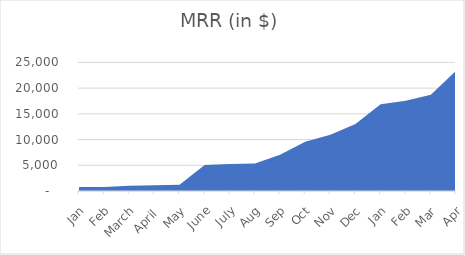
| Category | MRR |
|---|---|
|  Jan  | 761.1 |
|  Feb  | 761.1 |
|  March  | 1007.72 |
|  April   | 1100.94 |
|  May  | 1194.16 |
|  June  | 5074 |
|  July  | 5226.22 |
|  Aug  | 5354.84 |
|  Sep  | 7035.16 |
|  Oct  | 9570.98 |
|  Nov  | 10929.16 |
|  Dec  | 13016.58 |
|  Jan  | 16878.72 |
|  Feb  | 17567.84 |
|  Mar  | 18732.5 |
|  Apr  | 23356.92 |